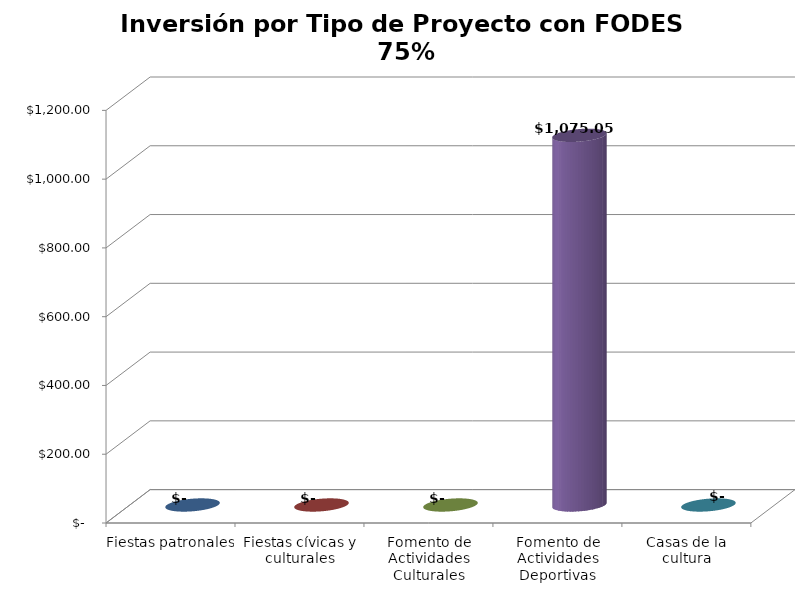
| Category | Series 0 |
|---|---|
| Fiestas patronales | 0 |
| Fiestas cívicas y culturales | 0 |
| Fomento de Actividades Culturales | 0 |
| Fomento de Actividades Deportivas | 1075.05 |
| Casas de la cultura | 0 |